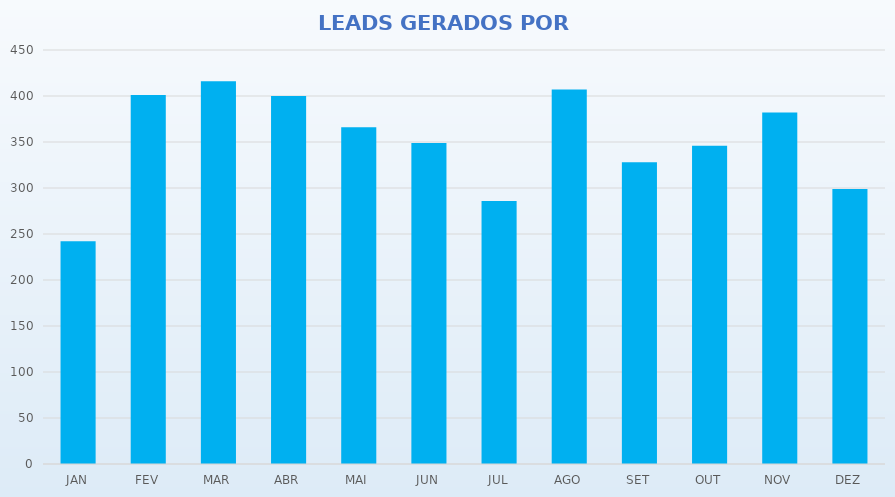
| Category | Series 0 |
|---|---|
| JAN | 242 |
| FEV | 401 |
| MAR | 416 |
| ABR | 400 |
| MAI | 366 |
| JUN | 349 |
| JUL | 286 |
| AGO | 407 |
| SET | 328 |
| OUT | 346 |
| NOV | 382 |
| DEZ | 299 |